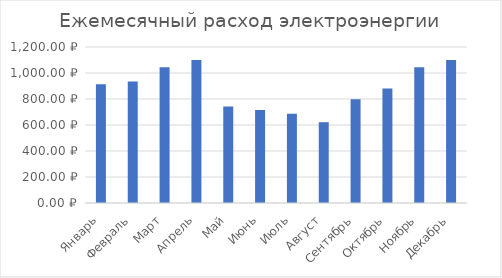
| Category | Series 0 |
|---|---|
| Январь | 913 |
| Февраль | 935 |
| Март | 1045 |
| Апрель | 1100 |
| Май | 742.5 |
| Июнь | 715 |
| Июль | 687.5 |
| Август | 621.5 |
| Сентябрь | 797.5 |
| Октябрь | 880 |
| Ноябрь | 1045 |
| Декабрь | 1100 |